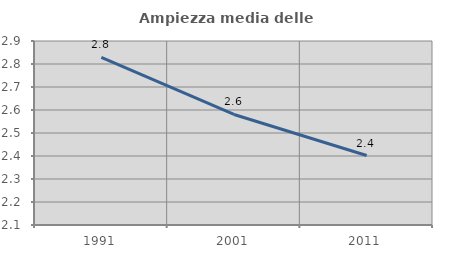
| Category | Ampiezza media delle famiglie |
|---|---|
| 1991.0 | 2.829 |
| 2001.0 | 2.581 |
| 2011.0 | 2.402 |